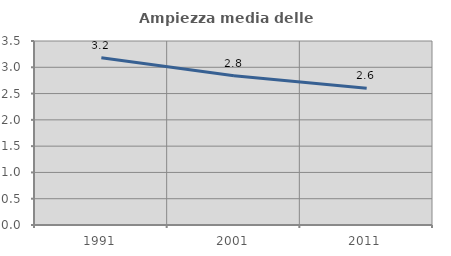
| Category | Ampiezza media delle famiglie |
|---|---|
| 1991.0 | 3.182 |
| 2001.0 | 2.839 |
| 2011.0 | 2.599 |